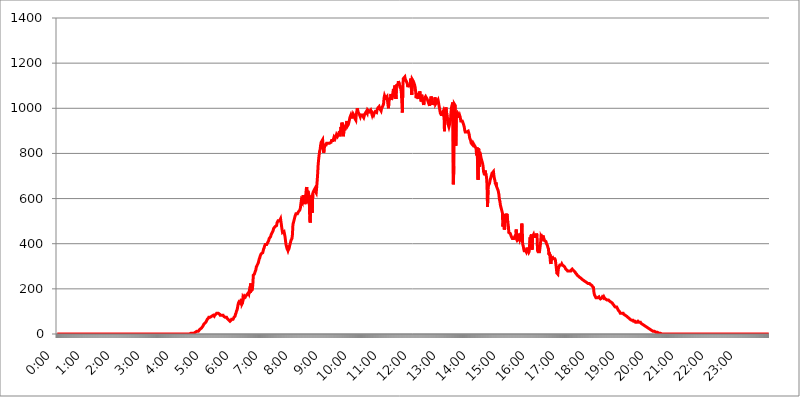
| Category | 2015.06.01. Intenzitás [W/m^2] |
|---|---|
| 0.0 | 0 |
| 0.0006944444444444445 | 0 |
| 0.001388888888888889 | 0 |
| 0.0020833333333333333 | 0 |
| 0.002777777777777778 | 0 |
| 0.003472222222222222 | 0 |
| 0.004166666666666667 | 0 |
| 0.004861111111111111 | 0 |
| 0.005555555555555556 | 0 |
| 0.0062499999999999995 | 0 |
| 0.006944444444444444 | 0 |
| 0.007638888888888889 | 0 |
| 0.008333333333333333 | 0 |
| 0.009027777777777779 | 0 |
| 0.009722222222222222 | 0 |
| 0.010416666666666666 | 0 |
| 0.011111111111111112 | 0 |
| 0.011805555555555555 | 0 |
| 0.012499999999999999 | 0 |
| 0.013194444444444444 | 0 |
| 0.013888888888888888 | 0 |
| 0.014583333333333332 | 0 |
| 0.015277777777777777 | 0 |
| 0.015972222222222224 | 0 |
| 0.016666666666666666 | 0 |
| 0.017361111111111112 | 0 |
| 0.018055555555555557 | 0 |
| 0.01875 | 0 |
| 0.019444444444444445 | 0 |
| 0.02013888888888889 | 0 |
| 0.020833333333333332 | 0 |
| 0.02152777777777778 | 0 |
| 0.022222222222222223 | 0 |
| 0.02291666666666667 | 0 |
| 0.02361111111111111 | 0 |
| 0.024305555555555556 | 0 |
| 0.024999999999999998 | 0 |
| 0.025694444444444447 | 0 |
| 0.02638888888888889 | 0 |
| 0.027083333333333334 | 0 |
| 0.027777777777777776 | 0 |
| 0.02847222222222222 | 0 |
| 0.029166666666666664 | 0 |
| 0.029861111111111113 | 0 |
| 0.030555555555555555 | 0 |
| 0.03125 | 0 |
| 0.03194444444444445 | 0 |
| 0.03263888888888889 | 0 |
| 0.03333333333333333 | 0 |
| 0.034027777777777775 | 0 |
| 0.034722222222222224 | 0 |
| 0.035416666666666666 | 0 |
| 0.036111111111111115 | 0 |
| 0.03680555555555556 | 0 |
| 0.0375 | 0 |
| 0.03819444444444444 | 0 |
| 0.03888888888888889 | 0 |
| 0.03958333333333333 | 0 |
| 0.04027777777777778 | 0 |
| 0.04097222222222222 | 0 |
| 0.041666666666666664 | 0 |
| 0.042361111111111106 | 0 |
| 0.04305555555555556 | 0 |
| 0.043750000000000004 | 0 |
| 0.044444444444444446 | 0 |
| 0.04513888888888889 | 0 |
| 0.04583333333333334 | 0 |
| 0.04652777777777778 | 0 |
| 0.04722222222222222 | 0 |
| 0.04791666666666666 | 0 |
| 0.04861111111111111 | 0 |
| 0.049305555555555554 | 0 |
| 0.049999999999999996 | 0 |
| 0.05069444444444445 | 0 |
| 0.051388888888888894 | 0 |
| 0.052083333333333336 | 0 |
| 0.05277777777777778 | 0 |
| 0.05347222222222222 | 0 |
| 0.05416666666666667 | 0 |
| 0.05486111111111111 | 0 |
| 0.05555555555555555 | 0 |
| 0.05625 | 0 |
| 0.05694444444444444 | 0 |
| 0.057638888888888885 | 0 |
| 0.05833333333333333 | 0 |
| 0.05902777777777778 | 0 |
| 0.059722222222222225 | 0 |
| 0.06041666666666667 | 0 |
| 0.061111111111111116 | 0 |
| 0.06180555555555556 | 0 |
| 0.0625 | 0 |
| 0.06319444444444444 | 0 |
| 0.06388888888888888 | 0 |
| 0.06458333333333334 | 0 |
| 0.06527777777777778 | 0 |
| 0.06597222222222222 | 0 |
| 0.06666666666666667 | 0 |
| 0.06736111111111111 | 0 |
| 0.06805555555555555 | 0 |
| 0.06874999999999999 | 0 |
| 0.06944444444444443 | 0 |
| 0.07013888888888889 | 0 |
| 0.07083333333333333 | 0 |
| 0.07152777777777779 | 0 |
| 0.07222222222222223 | 0 |
| 0.07291666666666667 | 0 |
| 0.07361111111111111 | 0 |
| 0.07430555555555556 | 0 |
| 0.075 | 0 |
| 0.07569444444444444 | 0 |
| 0.0763888888888889 | 0 |
| 0.07708333333333334 | 0 |
| 0.07777777777777778 | 0 |
| 0.07847222222222222 | 0 |
| 0.07916666666666666 | 0 |
| 0.0798611111111111 | 0 |
| 0.08055555555555556 | 0 |
| 0.08125 | 0 |
| 0.08194444444444444 | 0 |
| 0.08263888888888889 | 0 |
| 0.08333333333333333 | 0 |
| 0.08402777777777777 | 0 |
| 0.08472222222222221 | 0 |
| 0.08541666666666665 | 0 |
| 0.08611111111111112 | 0 |
| 0.08680555555555557 | 0 |
| 0.08750000000000001 | 0 |
| 0.08819444444444445 | 0 |
| 0.08888888888888889 | 0 |
| 0.08958333333333333 | 0 |
| 0.09027777777777778 | 0 |
| 0.09097222222222222 | 0 |
| 0.09166666666666667 | 0 |
| 0.09236111111111112 | 0 |
| 0.09305555555555556 | 0 |
| 0.09375 | 0 |
| 0.09444444444444444 | 0 |
| 0.09513888888888888 | 0 |
| 0.09583333333333333 | 0 |
| 0.09652777777777777 | 0 |
| 0.09722222222222222 | 0 |
| 0.09791666666666667 | 0 |
| 0.09861111111111111 | 0 |
| 0.09930555555555555 | 0 |
| 0.09999999999999999 | 0 |
| 0.10069444444444443 | 0 |
| 0.1013888888888889 | 0 |
| 0.10208333333333335 | 0 |
| 0.10277777777777779 | 0 |
| 0.10347222222222223 | 0 |
| 0.10416666666666667 | 0 |
| 0.10486111111111111 | 0 |
| 0.10555555555555556 | 0 |
| 0.10625 | 0 |
| 0.10694444444444444 | 0 |
| 0.1076388888888889 | 0 |
| 0.10833333333333334 | 0 |
| 0.10902777777777778 | 0 |
| 0.10972222222222222 | 0 |
| 0.1111111111111111 | 0 |
| 0.11180555555555556 | 0 |
| 0.11180555555555556 | 0 |
| 0.1125 | 0 |
| 0.11319444444444444 | 0 |
| 0.11388888888888889 | 0 |
| 0.11458333333333333 | 0 |
| 0.11527777777777777 | 0 |
| 0.11597222222222221 | 0 |
| 0.11666666666666665 | 0 |
| 0.1173611111111111 | 0 |
| 0.11805555555555557 | 0 |
| 0.11944444444444445 | 0 |
| 0.12013888888888889 | 0 |
| 0.12083333333333333 | 0 |
| 0.12152777777777778 | 0 |
| 0.12222222222222223 | 0 |
| 0.12291666666666667 | 0 |
| 0.12291666666666667 | 0 |
| 0.12361111111111112 | 0 |
| 0.12430555555555556 | 0 |
| 0.125 | 0 |
| 0.12569444444444444 | 0 |
| 0.12638888888888888 | 0 |
| 0.12708333333333333 | 0 |
| 0.16875 | 0 |
| 0.12847222222222224 | 0 |
| 0.12916666666666668 | 0 |
| 0.12986111111111112 | 0 |
| 0.13055555555555556 | 0 |
| 0.13125 | 0 |
| 0.13194444444444445 | 0 |
| 0.1326388888888889 | 0 |
| 0.13333333333333333 | 0 |
| 0.13402777777777777 | 0 |
| 0.13402777777777777 | 0 |
| 0.13472222222222222 | 0 |
| 0.13541666666666666 | 0 |
| 0.1361111111111111 | 0 |
| 0.13749999999999998 | 0 |
| 0.13819444444444443 | 0 |
| 0.1388888888888889 | 0 |
| 0.13958333333333334 | 0 |
| 0.14027777777777778 | 0 |
| 0.14097222222222222 | 0 |
| 0.14166666666666666 | 0 |
| 0.1423611111111111 | 0 |
| 0.14305555555555557 | 0 |
| 0.14375000000000002 | 0 |
| 0.14444444444444446 | 0 |
| 0.1451388888888889 | 0 |
| 0.1451388888888889 | 0 |
| 0.14652777777777778 | 0 |
| 0.14722222222222223 | 0 |
| 0.14791666666666667 | 0 |
| 0.1486111111111111 | 0 |
| 0.14930555555555555 | 0 |
| 0.15 | 0 |
| 0.15069444444444444 | 0 |
| 0.15138888888888888 | 0 |
| 0.15208333333333332 | 0 |
| 0.15277777777777776 | 0 |
| 0.15347222222222223 | 0 |
| 0.15416666666666667 | 0 |
| 0.15486111111111112 | 0 |
| 0.15555555555555556 | 0 |
| 0.15625 | 0 |
| 0.15694444444444444 | 0 |
| 0.15763888888888888 | 0 |
| 0.15833333333333333 | 0 |
| 0.15902777777777777 | 0 |
| 0.15972222222222224 | 0 |
| 0.16041666666666668 | 0 |
| 0.16111111111111112 | 0 |
| 0.16180555555555556 | 0 |
| 0.1625 | 0 |
| 0.16319444444444445 | 0 |
| 0.1638888888888889 | 0 |
| 0.16458333333333333 | 0 |
| 0.16527777777777777 | 0 |
| 0.16597222222222222 | 0 |
| 0.16666666666666666 | 0 |
| 0.1673611111111111 | 0 |
| 0.16805555555555554 | 0 |
| 0.16874999999999998 | 0 |
| 0.16944444444444443 | 0 |
| 0.17013888888888887 | 0 |
| 0.1708333333333333 | 0 |
| 0.17152777777777775 | 0 |
| 0.17222222222222225 | 0 |
| 0.1729166666666667 | 0 |
| 0.17361111111111113 | 0 |
| 0.17430555555555557 | 0 |
| 0.17500000000000002 | 0 |
| 0.17569444444444446 | 0 |
| 0.1763888888888889 | 0 |
| 0.17708333333333334 | 0 |
| 0.17777777777777778 | 0 |
| 0.17847222222222223 | 0 |
| 0.17916666666666667 | 0 |
| 0.1798611111111111 | 0 |
| 0.18055555555555555 | 0 |
| 0.18125 | 0 |
| 0.18194444444444444 | 0 |
| 0.1826388888888889 | 0 |
| 0.18333333333333335 | 0 |
| 0.1840277777777778 | 0 |
| 0.18472222222222223 | 0 |
| 0.18541666666666667 | 0 |
| 0.18611111111111112 | 3.525 |
| 0.18680555555555556 | 3.525 |
| 0.1875 | 3.525 |
| 0.18819444444444444 | 3.525 |
| 0.18888888888888888 | 3.525 |
| 0.18958333333333333 | 3.525 |
| 0.19027777777777777 | 3.525 |
| 0.1909722222222222 | 3.525 |
| 0.19166666666666665 | 3.525 |
| 0.19236111111111112 | 3.525 |
| 0.19305555555555554 | 7.887 |
| 0.19375 | 7.887 |
| 0.19444444444444445 | 7.887 |
| 0.1951388888888889 | 7.887 |
| 0.19583333333333333 | 12.257 |
| 0.19652777777777777 | 12.257 |
| 0.19722222222222222 | 12.257 |
| 0.19791666666666666 | 12.257 |
| 0.1986111111111111 | 16.636 |
| 0.19930555555555554 | 16.636 |
| 0.19999999999999998 | 21.024 |
| 0.20069444444444443 | 21.024 |
| 0.20138888888888887 | 25.419 |
| 0.2020833333333333 | 25.419 |
| 0.2027777777777778 | 29.823 |
| 0.2034722222222222 | 29.823 |
| 0.2041666666666667 | 34.234 |
| 0.20486111111111113 | 38.653 |
| 0.20555555555555557 | 43.079 |
| 0.20625000000000002 | 43.079 |
| 0.20694444444444446 | 47.511 |
| 0.2076388888888889 | 47.511 |
| 0.20833333333333334 | 51.951 |
| 0.20902777777777778 | 56.398 |
| 0.20972222222222223 | 60.85 |
| 0.21041666666666667 | 65.31 |
| 0.2111111111111111 | 65.31 |
| 0.21180555555555555 | 69.775 |
| 0.2125 | 74.246 |
| 0.21319444444444444 | 74.246 |
| 0.2138888888888889 | 74.246 |
| 0.21458333333333335 | 74.246 |
| 0.2152777777777778 | 74.246 |
| 0.21597222222222223 | 74.246 |
| 0.21666666666666667 | 78.722 |
| 0.21736111111111112 | 78.722 |
| 0.21805555555555556 | 78.722 |
| 0.21875 | 83.205 |
| 0.21944444444444444 | 83.205 |
| 0.22013888888888888 | 78.722 |
| 0.22083333333333333 | 83.205 |
| 0.22152777777777777 | 83.205 |
| 0.2222222222222222 | 87.692 |
| 0.22291666666666665 | 87.692 |
| 0.2236111111111111 | 92.184 |
| 0.22430555555555556 | 92.184 |
| 0.225 | 92.184 |
| 0.22569444444444445 | 92.184 |
| 0.2263888888888889 | 92.184 |
| 0.22708333333333333 | 92.184 |
| 0.22777777777777777 | 87.692 |
| 0.22847222222222222 | 83.205 |
| 0.22916666666666666 | 83.205 |
| 0.2298611111111111 | 83.205 |
| 0.23055555555555554 | 83.205 |
| 0.23124999999999998 | 83.205 |
| 0.23194444444444443 | 83.205 |
| 0.23263888888888887 | 83.205 |
| 0.2333333333333333 | 78.722 |
| 0.2340277777777778 | 78.722 |
| 0.2347222222222222 | 78.722 |
| 0.2354166666666667 | 74.246 |
| 0.23611111111111113 | 74.246 |
| 0.23680555555555557 | 74.246 |
| 0.23750000000000002 | 74.246 |
| 0.23819444444444446 | 69.775 |
| 0.2388888888888889 | 69.775 |
| 0.23958333333333334 | 65.31 |
| 0.24027777777777778 | 65.31 |
| 0.24097222222222223 | 60.85 |
| 0.24166666666666667 | 60.85 |
| 0.2423611111111111 | 56.398 |
| 0.24305555555555555 | 56.398 |
| 0.24375 | 60.85 |
| 0.24444444444444446 | 65.31 |
| 0.24513888888888888 | 65.31 |
| 0.24583333333333335 | 65.31 |
| 0.2465277777777778 | 65.31 |
| 0.24722222222222223 | 69.775 |
| 0.24791666666666667 | 74.246 |
| 0.24861111111111112 | 74.246 |
| 0.24930555555555556 | 78.722 |
| 0.25 | 87.692 |
| 0.25069444444444444 | 92.184 |
| 0.2513888888888889 | 101.184 |
| 0.2520833333333333 | 105.69 |
| 0.25277777777777777 | 114.716 |
| 0.2534722222222222 | 128.284 |
| 0.25416666666666665 | 137.347 |
| 0.2548611111111111 | 141.884 |
| 0.2555555555555556 | 141.884 |
| 0.25625000000000003 | 137.347 |
| 0.2569444444444445 | 137.347 |
| 0.2576388888888889 | 137.347 |
| 0.25833333333333336 | 155.509 |
| 0.2590277777777778 | 132.814 |
| 0.25972222222222224 | 137.347 |
| 0.2604166666666667 | 160.056 |
| 0.2611111111111111 | 155.509 |
| 0.26180555555555557 | 164.605 |
| 0.2625 | 169.156 |
| 0.26319444444444445 | 169.156 |
| 0.2638888888888889 | 164.605 |
| 0.26458333333333334 | 169.156 |
| 0.2652777777777778 | 169.156 |
| 0.2659722222222222 | 173.709 |
| 0.26666666666666666 | 173.709 |
| 0.2673611111111111 | 173.709 |
| 0.26805555555555555 | 182.82 |
| 0.26875 | 178.264 |
| 0.26944444444444443 | 191.937 |
| 0.2701388888888889 | 191.937 |
| 0.2708333333333333 | 182.82 |
| 0.27152777777777776 | 223.873 |
| 0.2722222222222222 | 191.937 |
| 0.27291666666666664 | 191.937 |
| 0.2736111111111111 | 196.497 |
| 0.2743055555555555 | 219.309 |
| 0.27499999999999997 | 260.373 |
| 0.27569444444444446 | 260.373 |
| 0.27638888888888885 | 264.932 |
| 0.27708333333333335 | 264.932 |
| 0.2777777777777778 | 278.603 |
| 0.27847222222222223 | 283.156 |
| 0.2791666666666667 | 296.808 |
| 0.2798611111111111 | 301.354 |
| 0.28055555555555556 | 305.898 |
| 0.28125 | 310.44 |
| 0.28194444444444444 | 314.98 |
| 0.2826388888888889 | 324.052 |
| 0.2833333333333333 | 333.113 |
| 0.28402777777777777 | 337.639 |
| 0.2847222222222222 | 346.682 |
| 0.28541666666666665 | 351.198 |
| 0.28611111111111115 | 355.712 |
| 0.28680555555555554 | 355.712 |
| 0.28750000000000003 | 355.712 |
| 0.2881944444444445 | 360.221 |
| 0.2888888888888889 | 369.23 |
| 0.28958333333333336 | 378.224 |
| 0.2902777777777778 | 382.715 |
| 0.29097222222222224 | 391.685 |
| 0.2916666666666667 | 396.164 |
| 0.2923611111111111 | 396.164 |
| 0.29305555555555557 | 396.164 |
| 0.29375 | 396.164 |
| 0.29444444444444445 | 400.638 |
| 0.2951388888888889 | 405.108 |
| 0.29583333333333334 | 409.574 |
| 0.2965277777777778 | 414.035 |
| 0.2972222222222222 | 422.943 |
| 0.29791666666666666 | 422.943 |
| 0.2986111111111111 | 422.943 |
| 0.29930555555555555 | 431.833 |
| 0.3 | 440.702 |
| 0.30069444444444443 | 440.702 |
| 0.3013888888888889 | 449.551 |
| 0.3020833333333333 | 449.551 |
| 0.30277777777777776 | 458.38 |
| 0.3034722222222222 | 467.187 |
| 0.30416666666666664 | 471.582 |
| 0.3048611111111111 | 471.582 |
| 0.3055555555555555 | 475.972 |
| 0.30624999999999997 | 471.582 |
| 0.3069444444444444 | 471.582 |
| 0.3076388888888889 | 480.356 |
| 0.30833333333333335 | 493.475 |
| 0.3090277777777778 | 497.836 |
| 0.30972222222222223 | 502.192 |
| 0.3104166666666667 | 502.192 |
| 0.3111111111111111 | 502.192 |
| 0.31180555555555556 | 502.192 |
| 0.3125 | 506.542 |
| 0.31319444444444444 | 510.885 |
| 0.3138888888888889 | 515.223 |
| 0.3145833333333333 | 510.885 |
| 0.31527777777777777 | 462.786 |
| 0.3159722222222222 | 449.551 |
| 0.31666666666666665 | 449.551 |
| 0.31736111111111115 | 453.968 |
| 0.31805555555555554 | 453.968 |
| 0.31875000000000003 | 449.551 |
| 0.3194444444444445 | 431.833 |
| 0.3201388888888889 | 414.035 |
| 0.32083333333333336 | 396.164 |
| 0.3215277777777778 | 387.202 |
| 0.32222222222222224 | 378.224 |
| 0.3229166666666667 | 373.729 |
| 0.3236111111111111 | 391.685 |
| 0.32430555555555557 | 373.729 |
| 0.325 | 378.224 |
| 0.32569444444444445 | 387.202 |
| 0.3263888888888889 | 396.164 |
| 0.32708333333333334 | 405.108 |
| 0.3277777777777778 | 414.035 |
| 0.3284722222222222 | 418.492 |
| 0.32916666666666666 | 422.943 |
| 0.3298611111111111 | 440.702 |
| 0.33055555555555555 | 484.735 |
| 0.33125 | 493.475 |
| 0.33194444444444443 | 502.192 |
| 0.3326388888888889 | 510.885 |
| 0.3333333333333333 | 519.555 |
| 0.3340277777777778 | 523.88 |
| 0.3347222222222222 | 532.513 |
| 0.3354166666666667 | 532.513 |
| 0.3361111111111111 | 532.513 |
| 0.3368055555555556 | 532.513 |
| 0.33749999999999997 | 536.82 |
| 0.33819444444444446 | 541.121 |
| 0.33888888888888885 | 541.121 |
| 0.33958333333333335 | 545.416 |
| 0.34027777777777773 | 549.704 |
| 0.34097222222222223 | 558.261 |
| 0.3416666666666666 | 575.299 |
| 0.3423611111111111 | 592.233 |
| 0.3430555555555555 | 592.233 |
| 0.34375 | 583.779 |
| 0.3444444444444445 | 609.062 |
| 0.3451388888888889 | 609.062 |
| 0.3458333333333334 | 613.252 |
| 0.34652777777777777 | 609.062 |
| 0.34722222222222227 | 575.299 |
| 0.34791666666666665 | 583.779 |
| 0.34861111111111115 | 617.436 |
| 0.34930555555555554 | 642.4 |
| 0.35000000000000003 | 650.667 |
| 0.3506944444444444 | 579.542 |
| 0.3513888888888889 | 634.105 |
| 0.3520833333333333 | 629.948 |
| 0.3527777777777778 | 617.436 |
| 0.3534722222222222 | 588.009 |
| 0.3541666666666667 | 506.542 |
| 0.3548611111111111 | 493.475 |
| 0.35555555555555557 | 613.252 |
| 0.35625 | 609.062 |
| 0.35694444444444445 | 596.45 |
| 0.3576388888888889 | 536.82 |
| 0.35833333333333334 | 621.613 |
| 0.3590277777777778 | 629.948 |
| 0.3597222222222222 | 629.948 |
| 0.36041666666666666 | 634.105 |
| 0.3611111111111111 | 642.4 |
| 0.36180555555555555 | 634.105 |
| 0.3625 | 629.948 |
| 0.36319444444444443 | 625.784 |
| 0.3638888888888889 | 650.667 |
| 0.3645833333333333 | 679.395 |
| 0.3652777777777778 | 711.832 |
| 0.3659722222222222 | 751.803 |
| 0.3666666666666667 | 775.492 |
| 0.3673611111111111 | 795.074 |
| 0.3680555555555556 | 810.641 |
| 0.36874999999999997 | 818.392 |
| 0.36944444444444446 | 837.682 |
| 0.37013888888888885 | 849.199 |
| 0.37083333333333335 | 849.199 |
| 0.37152777777777773 | 853.029 |
| 0.37222222222222223 | 860.676 |
| 0.3729166666666666 | 856.855 |
| 0.3736111111111111 | 802.868 |
| 0.3743055555555555 | 810.641 |
| 0.375 | 837.682 |
| 0.3756944444444445 | 837.682 |
| 0.3763888888888889 | 837.682 |
| 0.3770833333333334 | 837.682 |
| 0.37777777777777777 | 845.365 |
| 0.37847222222222227 | 845.365 |
| 0.37916666666666665 | 845.365 |
| 0.37986111111111115 | 845.365 |
| 0.38055555555555554 | 845.365 |
| 0.38125000000000003 | 849.199 |
| 0.3819444444444444 | 845.365 |
| 0.3826388888888889 | 845.365 |
| 0.3833333333333333 | 849.199 |
| 0.3840277777777778 | 849.199 |
| 0.3847222222222222 | 856.855 |
| 0.3854166666666667 | 860.676 |
| 0.3861111111111111 | 853.029 |
| 0.38680555555555557 | 856.855 |
| 0.3875 | 853.029 |
| 0.38819444444444445 | 872.114 |
| 0.3888888888888889 | 875.918 |
| 0.38958333333333334 | 864.493 |
| 0.3902777777777778 | 864.493 |
| 0.3909722222222222 | 875.918 |
| 0.39166666666666666 | 883.516 |
| 0.3923611111111111 | 879.719 |
| 0.39305555555555555 | 875.918 |
| 0.39375 | 875.918 |
| 0.39444444444444443 | 879.719 |
| 0.3951388888888889 | 891.099 |
| 0.3958333333333333 | 898.668 |
| 0.3965277777777778 | 875.918 |
| 0.3972222222222222 | 898.668 |
| 0.3979166666666667 | 917.534 |
| 0.3986111111111111 | 902.447 |
| 0.3993055555555556 | 936.33 |
| 0.39999999999999997 | 932.576 |
| 0.40069444444444446 | 921.298 |
| 0.40138888888888885 | 875.918 |
| 0.40208333333333335 | 909.996 |
| 0.40277777777777773 | 902.447 |
| 0.40347222222222223 | 917.534 |
| 0.4041666666666666 | 917.534 |
| 0.4048611111111111 | 925.06 |
| 0.4055555555555555 | 932.576 |
| 0.40625 | 943.832 |
| 0.4069444444444445 | 921.298 |
| 0.4076388888888889 | 921.298 |
| 0.4083333333333334 | 928.819 |
| 0.40902777777777777 | 932.576 |
| 0.40972222222222227 | 947.58 |
| 0.41041666666666665 | 958.814 |
| 0.41111111111111115 | 962.555 |
| 0.41180555555555554 | 970.034 |
| 0.41250000000000003 | 962.555 |
| 0.4131944444444444 | 955.071 |
| 0.4138888888888889 | 966.295 |
| 0.4145833333333333 | 958.814 |
| 0.4152777777777778 | 973.772 |
| 0.4159722222222222 | 977.508 |
| 0.4166666666666667 | 966.295 |
| 0.4173611111111111 | 955.071 |
| 0.41805555555555557 | 958.814 |
| 0.41875 | 947.58 |
| 0.41944444444444445 | 973.772 |
| 0.4201388888888889 | 984.98 |
| 0.42083333333333334 | 999.916 |
| 0.4215277777777778 | 988.714 |
| 0.4222222222222222 | 981.244 |
| 0.42291666666666666 | 977.508 |
| 0.4236111111111111 | 973.772 |
| 0.42430555555555555 | 973.772 |
| 0.425 | 962.555 |
| 0.42569444444444443 | 970.034 |
| 0.4263888888888889 | 973.772 |
| 0.4270833333333333 | 970.034 |
| 0.4277777777777778 | 970.034 |
| 0.4284722222222222 | 973.772 |
| 0.4291666666666667 | 970.034 |
| 0.4298611111111111 | 958.814 |
| 0.4305555555555556 | 958.814 |
| 0.43124999999999997 | 973.772 |
| 0.43194444444444446 | 973.772 |
| 0.43263888888888885 | 977.508 |
| 0.43333333333333335 | 984.98 |
| 0.43402777777777773 | 984.98 |
| 0.43472222222222223 | 977.508 |
| 0.4354166666666666 | 992.448 |
| 0.4361111111111111 | 988.714 |
| 0.4368055555555555 | 992.448 |
| 0.4375 | 984.98 |
| 0.4381944444444445 | 988.714 |
| 0.4388888888888889 | 984.98 |
| 0.4395833333333334 | 992.448 |
| 0.44027777777777777 | 992.448 |
| 0.44097222222222227 | 977.508 |
| 0.44166666666666665 | 970.034 |
| 0.44236111111111115 | 977.508 |
| 0.44305555555555554 | 973.772 |
| 0.44375000000000003 | 970.034 |
| 0.4444444444444444 | 977.508 |
| 0.4451388888888889 | 981.244 |
| 0.4458333333333333 | 984.98 |
| 0.4465277777777778 | 981.244 |
| 0.4472222222222222 | 988.714 |
| 0.4479166666666667 | 981.244 |
| 0.4486111111111111 | 992.448 |
| 0.44930555555555557 | 999.916 |
| 0.45 | 999.916 |
| 0.45069444444444445 | 999.916 |
| 0.4513888888888889 | 1007.383 |
| 0.45208333333333334 | 999.916 |
| 0.4527777777777778 | 996.182 |
| 0.4534722222222222 | 999.916 |
| 0.45416666666666666 | 988.714 |
| 0.4548611111111111 | 999.916 |
| 0.45555555555555555 | 1003.65 |
| 0.45625 | 1007.383 |
| 0.45694444444444443 | 1011.118 |
| 0.4576388888888889 | 1018.587 |
| 0.4583333333333333 | 1044.762 |
| 0.4590277777777778 | 1056.004 |
| 0.4597222222222222 | 1052.255 |
| 0.4604166666666667 | 1044.762 |
| 0.4611111111111111 | 1048.508 |
| 0.4618055555555556 | 1044.762 |
| 0.46249999999999997 | 1052.255 |
| 0.46319444444444446 | 1048.508 |
| 0.46388888888888885 | 1014.852 |
| 0.46458333333333335 | 999.916 |
| 0.46527777777777773 | 1041.019 |
| 0.46597222222222223 | 1044.762 |
| 0.4666666666666666 | 1041.019 |
| 0.4673611111111111 | 1044.762 |
| 0.4680555555555555 | 1063.51 |
| 0.46875 | 1037.277 |
| 0.4694444444444445 | 1033.537 |
| 0.4701388888888889 | 1052.255 |
| 0.4708333333333334 | 1071.027 |
| 0.47152777777777777 | 1086.097 |
| 0.47222222222222227 | 1078.555 |
| 0.47291666666666665 | 1086.097 |
| 0.47361111111111115 | 1101.226 |
| 0.47430555555555554 | 1105.019 |
| 0.47500000000000003 | 1041.019 |
| 0.4756944444444444 | 1101.226 |
| 0.4763888888888889 | 1101.226 |
| 0.4770833333333333 | 1097.437 |
| 0.4777777777777778 | 1105.019 |
| 0.4784722222222222 | 1120.238 |
| 0.4791666666666667 | 1116.426 |
| 0.4798611111111111 | 1105.019 |
| 0.48055555555555557 | 1093.653 |
| 0.48125 | 1089.873 |
| 0.48194444444444445 | 1086.097 |
| 0.4826388888888889 | 1067.267 |
| 0.48333333333333334 | 1063.51 |
| 0.4840277777777778 | 981.244 |
| 0.4847222222222222 | 1101.226 |
| 0.48541666666666666 | 1131.708 |
| 0.4861111111111111 | 1135.543 |
| 0.48680555555555555 | 1131.708 |
| 0.4875 | 1139.384 |
| 0.48819444444444443 | 1127.879 |
| 0.4888888888888889 | 1124.056 |
| 0.4895833333333333 | 1120.238 |
| 0.4902777777777778 | 1120.238 |
| 0.4909722222222222 | 1108.816 |
| 0.4916666666666667 | 1093.653 |
| 0.4923611111111111 | 1101.226 |
| 0.4930555555555556 | 1105.019 |
| 0.49374999999999997 | 1097.437 |
| 0.49444444444444446 | 1101.226 |
| 0.49513888888888885 | 1112.618 |
| 0.49583333333333335 | 1131.708 |
| 0.49652777777777773 | 1131.708 |
| 0.49722222222222223 | 1059.756 |
| 0.4979166666666666 | 1127.879 |
| 0.4986111111111111 | 1124.056 |
| 0.4993055555555555 | 1120.238 |
| 0.5 | 1116.426 |
| 0.5006944444444444 | 1108.816 |
| 0.5013888888888889 | 1101.226 |
| 0.5020833333333333 | 1089.873 |
| 0.5027777777777778 | 1071.027 |
| 0.5034722222222222 | 1044.762 |
| 0.5041666666666667 | 1067.267 |
| 0.5048611111111111 | 1059.756 |
| 0.5055555555555555 | 1056.004 |
| 0.50625 | 1041.019 |
| 0.5069444444444444 | 1056.004 |
| 0.5076388888888889 | 1059.756 |
| 0.5083333333333333 | 1074.789 |
| 0.5090277777777777 | 1067.267 |
| 0.5097222222222222 | 1063.51 |
| 0.5104166666666666 | 1029.798 |
| 0.5111111111111112 | 1059.756 |
| 0.5118055555555555 | 1063.51 |
| 0.5125000000000001 | 1037.277 |
| 0.5131944444444444 | 1033.537 |
| 0.513888888888889 | 1014.852 |
| 0.5145833333333333 | 1026.06 |
| 0.5152777777777778 | 1044.762 |
| 0.5159722222222222 | 1044.762 |
| 0.5166666666666667 | 1052.255 |
| 0.517361111111111 | 1056.004 |
| 0.5180555555555556 | 1052.255 |
| 0.5187499999999999 | 1041.019 |
| 0.5194444444444445 | 1041.019 |
| 0.5201388888888888 | 1029.798 |
| 0.5208333333333334 | 1022.323 |
| 0.5215277777777778 | 1022.323 |
| 0.5222222222222223 | 1011.118 |
| 0.5229166666666667 | 1029.798 |
| 0.5236111111111111 | 1033.537 |
| 0.5243055555555556 | 1052.255 |
| 0.525 | 1056.004 |
| 0.5256944444444445 | 1037.277 |
| 0.5263888888888889 | 1014.852 |
| 0.5270833333333333 | 1022.323 |
| 0.5277777777777778 | 1029.798 |
| 0.5284722222222222 | 1018.587 |
| 0.5291666666666667 | 1029.798 |
| 0.5298611111111111 | 1048.508 |
| 0.5305555555555556 | 1018.587 |
| 0.53125 | 1014.852 |
| 0.5319444444444444 | 1018.587 |
| 0.5326388888888889 | 1029.798 |
| 0.5333333333333333 | 1033.537 |
| 0.5340277777777778 | 1037.277 |
| 0.5347222222222222 | 1026.06 |
| 0.5354166666666667 | 1011.118 |
| 0.5361111111111111 | 999.916 |
| 0.5368055555555555 | 988.714 |
| 0.5375 | 973.772 |
| 0.5381944444444444 | 984.98 |
| 0.5388888888888889 | 966.295 |
| 0.5395833333333333 | 962.555 |
| 0.5402777777777777 | 977.508 |
| 0.5409722222222222 | 981.244 |
| 0.5416666666666666 | 988.714 |
| 0.5423611111111112 | 977.508 |
| 0.5430555555555555 | 898.668 |
| 0.5437500000000001 | 977.508 |
| 0.5444444444444444 | 992.448 |
| 0.545138888888889 | 1003.65 |
| 0.5458333333333333 | 1007.383 |
| 0.5465277777777778 | 1007.383 |
| 0.5472222222222222 | 951.327 |
| 0.5479166666666667 | 932.576 |
| 0.548611111111111 | 925.06 |
| 0.5493055555555556 | 917.534 |
| 0.5499999999999999 | 917.534 |
| 0.5506944444444445 | 921.298 |
| 0.5513888888888888 | 943.832 |
| 0.5520833333333334 | 973.772 |
| 0.5527777777777778 | 999.916 |
| 0.5534722222222223 | 1011.118 |
| 0.5541666666666667 | 1007.383 |
| 0.5548611111111111 | 1026.06 |
| 0.5555555555555556 | 663.019 |
| 0.55625 | 743.859 |
| 0.5569444444444445 | 1018.587 |
| 0.5576388888888889 | 1018.587 |
| 0.5583333333333333 | 1011.118 |
| 0.5590277777777778 | 833.834 |
| 0.5597222222222222 | 984.98 |
| 0.5604166666666667 | 958.814 |
| 0.5611111111111111 | 970.034 |
| 0.5618055555555556 | 977.508 |
| 0.5625 | 977.508 |
| 0.5631944444444444 | 970.034 |
| 0.5638888888888889 | 958.814 |
| 0.5645833333333333 | 966.295 |
| 0.5652777777777778 | 958.814 |
| 0.5659722222222222 | 943.832 |
| 0.5666666666666667 | 947.58 |
| 0.5673611111111111 | 940.082 |
| 0.5680555555555555 | 943.832 |
| 0.56875 | 940.082 |
| 0.5694444444444444 | 932.576 |
| 0.5701388888888889 | 932.576 |
| 0.5708333333333333 | 917.534 |
| 0.5715277777777777 | 902.447 |
| 0.5722222222222222 | 894.885 |
| 0.5729166666666666 | 898.668 |
| 0.5736111111111112 | 894.885 |
| 0.5743055555555555 | 894.885 |
| 0.5750000000000001 | 898.668 |
| 0.5756944444444444 | 894.885 |
| 0.576388888888889 | 898.668 |
| 0.5770833333333333 | 891.099 |
| 0.5777777777777778 | 883.516 |
| 0.5784722222222222 | 868.305 |
| 0.5791666666666667 | 864.493 |
| 0.579861111111111 | 856.855 |
| 0.5805555555555556 | 845.365 |
| 0.5812499999999999 | 841.526 |
| 0.5819444444444445 | 845.365 |
| 0.5826388888888888 | 837.682 |
| 0.5833333333333334 | 845.365 |
| 0.5840277777777778 | 841.526 |
| 0.5847222222222223 | 837.682 |
| 0.5854166666666667 | 833.834 |
| 0.5861111111111111 | 833.834 |
| 0.5868055555555556 | 826.123 |
| 0.5875 | 818.392 |
| 0.5881944444444445 | 791.169 |
| 0.5888888888888889 | 826.123 |
| 0.5895833333333333 | 826.123 |
| 0.5902777777777778 | 683.473 |
| 0.5909722222222222 | 822.26 |
| 0.5916666666666667 | 739.877 |
| 0.5923611111111111 | 806.757 |
| 0.5930555555555556 | 802.868 |
| 0.59375 | 791.169 |
| 0.5944444444444444 | 779.42 |
| 0.5951388888888889 | 771.559 |
| 0.5958333333333333 | 767.62 |
| 0.5965277777777778 | 755.766 |
| 0.5972222222222222 | 743.859 |
| 0.5979166666666667 | 719.877 |
| 0.5986111111111111 | 723.889 |
| 0.5993055555555555 | 703.762 |
| 0.6 | 723.889 |
| 0.6006944444444444 | 723.889 |
| 0.6013888888888889 | 703.762 |
| 0.6020833333333333 | 695.666 |
| 0.6027777777777777 | 658.909 |
| 0.6034722222222222 | 562.53 |
| 0.6041666666666666 | 638.256 |
| 0.6048611111111112 | 658.909 |
| 0.6055555555555555 | 658.909 |
| 0.6062500000000001 | 667.123 |
| 0.6069444444444444 | 679.395 |
| 0.607638888888889 | 683.473 |
| 0.6083333333333333 | 695.666 |
| 0.6090277777777778 | 703.762 |
| 0.6097222222222222 | 711.832 |
| 0.6104166666666667 | 715.858 |
| 0.611111111111111 | 715.858 |
| 0.6118055555555556 | 719.877 |
| 0.6124999999999999 | 699.717 |
| 0.6131944444444445 | 687.544 |
| 0.6138888888888888 | 679.395 |
| 0.6145833333333334 | 663.019 |
| 0.6152777777777778 | 671.22 |
| 0.6159722222222223 | 654.791 |
| 0.6166666666666667 | 658.909 |
| 0.6173611111111111 | 654.791 |
| 0.6180555555555556 | 638.256 |
| 0.61875 | 629.948 |
| 0.6194444444444445 | 617.436 |
| 0.6201388888888889 | 596.45 |
| 0.6208333333333333 | 588.009 |
| 0.6215277777777778 | 571.049 |
| 0.6222222222222222 | 566.793 |
| 0.6229166666666667 | 553.986 |
| 0.6236111111111111 | 549.704 |
| 0.6243055555555556 | 536.82 |
| 0.625 | 475.972 |
| 0.6256944444444444 | 471.582 |
| 0.6263888888888889 | 506.542 |
| 0.6270833333333333 | 462.786 |
| 0.6277777777777778 | 471.582 |
| 0.6284722222222222 | 532.513 |
| 0.6291666666666667 | 515.223 |
| 0.6298611111111111 | 497.836 |
| 0.6305555555555555 | 532.513 |
| 0.63125 | 532.513 |
| 0.6319444444444444 | 493.475 |
| 0.6326388888888889 | 480.356 |
| 0.6333333333333333 | 449.551 |
| 0.6340277777777777 | 445.129 |
| 0.6347222222222222 | 445.129 |
| 0.6354166666666666 | 445.129 |
| 0.6361111111111112 | 440.702 |
| 0.6368055555555555 | 431.833 |
| 0.6375000000000001 | 427.39 |
| 0.6381944444444444 | 422.943 |
| 0.638888888888889 | 422.943 |
| 0.6395833333333333 | 422.943 |
| 0.6402777777777778 | 422.943 |
| 0.6409722222222222 | 427.39 |
| 0.6416666666666667 | 431.833 |
| 0.642361111111111 | 431.833 |
| 0.6430555555555556 | 427.39 |
| 0.6437499999999999 | 462.786 |
| 0.6444444444444445 | 418.492 |
| 0.6451388888888888 | 414.035 |
| 0.6458333333333334 | 414.035 |
| 0.6465277777777778 | 418.492 |
| 0.6472222222222223 | 418.492 |
| 0.6479166666666667 | 427.39 |
| 0.6486111111111111 | 445.129 |
| 0.6493055555555556 | 418.492 |
| 0.65 | 418.492 |
| 0.6506944444444445 | 427.39 |
| 0.6513888888888889 | 489.108 |
| 0.6520833333333333 | 475.972 |
| 0.6527777777777778 | 396.164 |
| 0.6534722222222222 | 391.685 |
| 0.6541666666666667 | 378.224 |
| 0.6548611111111111 | 369.23 |
| 0.6555555555555556 | 369.23 |
| 0.65625 | 369.23 |
| 0.6569444444444444 | 369.23 |
| 0.6576388888888889 | 364.728 |
| 0.6583333333333333 | 364.728 |
| 0.6590277777777778 | 382.715 |
| 0.6597222222222222 | 369.23 |
| 0.6604166666666667 | 364.728 |
| 0.6611111111111111 | 360.221 |
| 0.6618055555555555 | 364.728 |
| 0.6625 | 364.728 |
| 0.6631944444444444 | 427.39 |
| 0.6638888888888889 | 378.224 |
| 0.6645833333333333 | 436.27 |
| 0.6652777777777777 | 440.702 |
| 0.6659722222222222 | 373.729 |
| 0.6666666666666666 | 431.833 |
| 0.6673611111111111 | 436.27 |
| 0.6680555555555556 | 440.702 |
| 0.6687500000000001 | 431.833 |
| 0.6694444444444444 | 431.833 |
| 0.6701388888888888 | 431.833 |
| 0.6708333333333334 | 431.833 |
| 0.6715277777777778 | 436.27 |
| 0.6722222222222222 | 445.129 |
| 0.6729166666666666 | 436.27 |
| 0.6736111111111112 | 369.23 |
| 0.6743055555555556 | 364.728 |
| 0.6749999999999999 | 364.728 |
| 0.6756944444444444 | 364.728 |
| 0.6763888888888889 | 364.728 |
| 0.6770833333333334 | 364.728 |
| 0.6777777777777777 | 400.638 |
| 0.6784722222222223 | 431.833 |
| 0.6791666666666667 | 427.39 |
| 0.6798611111111111 | 431.833 |
| 0.6805555555555555 | 427.39 |
| 0.68125 | 436.27 |
| 0.6819444444444445 | 427.39 |
| 0.6826388888888889 | 422.943 |
| 0.6833333333333332 | 414.035 |
| 0.6840277777777778 | 414.035 |
| 0.6847222222222222 | 414.035 |
| 0.6854166666666667 | 409.574 |
| 0.686111111111111 | 400.638 |
| 0.6868055555555556 | 396.164 |
| 0.6875 | 391.685 |
| 0.6881944444444444 | 382.715 |
| 0.688888888888889 | 378.224 |
| 0.6895833333333333 | 351.198 |
| 0.6902777777777778 | 360.221 |
| 0.6909722222222222 | 346.682 |
| 0.6916666666666668 | 319.517 |
| 0.6923611111111111 | 310.44 |
| 0.6930555555555555 | 337.639 |
| 0.69375 | 333.113 |
| 0.6944444444444445 | 333.113 |
| 0.6951388888888889 | 337.639 |
| 0.6958333333333333 | 333.113 |
| 0.6965277777777777 | 333.113 |
| 0.6972222222222223 | 333.113 |
| 0.6979166666666666 | 333.113 |
| 0.6986111111111111 | 328.584 |
| 0.6993055555555556 | 328.584 |
| 0.7000000000000001 | 292.259 |
| 0.7006944444444444 | 269.49 |
| 0.7013888888888888 | 269.49 |
| 0.7020833333333334 | 264.932 |
| 0.7027777777777778 | 287.709 |
| 0.7034722222222222 | 296.808 |
| 0.7041666666666666 | 301.354 |
| 0.7048611111111112 | 305.898 |
| 0.7055555555555556 | 305.898 |
| 0.7062499999999999 | 305.898 |
| 0.7069444444444444 | 305.898 |
| 0.7076388888888889 | 310.44 |
| 0.7083333333333334 | 305.898 |
| 0.7090277777777777 | 305.898 |
| 0.7097222222222223 | 305.898 |
| 0.7104166666666667 | 301.354 |
| 0.7111111111111111 | 301.354 |
| 0.7118055555555555 | 296.808 |
| 0.7125 | 292.259 |
| 0.7131944444444445 | 287.709 |
| 0.7138888888888889 | 287.709 |
| 0.7145833333333332 | 283.156 |
| 0.7152777777777778 | 283.156 |
| 0.7159722222222222 | 278.603 |
| 0.7166666666666667 | 278.603 |
| 0.717361111111111 | 278.603 |
| 0.7180555555555556 | 278.603 |
| 0.71875 | 278.603 |
| 0.7194444444444444 | 278.603 |
| 0.720138888888889 | 278.603 |
| 0.7208333333333333 | 283.156 |
| 0.7215277777777778 | 283.156 |
| 0.7222222222222222 | 287.709 |
| 0.7229166666666668 | 287.709 |
| 0.7236111111111111 | 283.156 |
| 0.7243055555555555 | 283.156 |
| 0.725 | 278.603 |
| 0.7256944444444445 | 278.603 |
| 0.7263888888888889 | 274.047 |
| 0.7270833333333333 | 269.49 |
| 0.7277777777777777 | 269.49 |
| 0.7284722222222223 | 264.932 |
| 0.7291666666666666 | 260.373 |
| 0.7298611111111111 | 260.373 |
| 0.7305555555555556 | 260.373 |
| 0.7312500000000001 | 255.813 |
| 0.7319444444444444 | 255.813 |
| 0.7326388888888888 | 251.251 |
| 0.7333333333333334 | 251.251 |
| 0.7340277777777778 | 251.251 |
| 0.7347222222222222 | 246.689 |
| 0.7354166666666666 | 246.689 |
| 0.7361111111111112 | 242.127 |
| 0.7368055555555556 | 242.127 |
| 0.7374999999999999 | 242.127 |
| 0.7381944444444444 | 237.564 |
| 0.7388888888888889 | 237.564 |
| 0.7395833333333334 | 237.564 |
| 0.7402777777777777 | 233 |
| 0.7409722222222223 | 233 |
| 0.7416666666666667 | 233 |
| 0.7423611111111111 | 228.436 |
| 0.7430555555555555 | 228.436 |
| 0.74375 | 228.436 |
| 0.7444444444444445 | 223.873 |
| 0.7451388888888889 | 223.873 |
| 0.7458333333333332 | 223.873 |
| 0.7465277777777778 | 223.873 |
| 0.7472222222222222 | 223.873 |
| 0.7479166666666667 | 219.309 |
| 0.748611111111111 | 219.309 |
| 0.7493055555555556 | 219.309 |
| 0.75 | 214.746 |
| 0.7506944444444444 | 210.182 |
| 0.751388888888889 | 210.182 |
| 0.7520833333333333 | 205.62 |
| 0.7527777777777778 | 182.82 |
| 0.7534722222222222 | 173.709 |
| 0.7541666666666668 | 169.156 |
| 0.7548611111111111 | 164.605 |
| 0.7555555555555555 | 160.056 |
| 0.75625 | 160.056 |
| 0.7569444444444445 | 160.056 |
| 0.7576388888888889 | 160.056 |
| 0.7583333333333333 | 160.056 |
| 0.7590277777777777 | 160.056 |
| 0.7597222222222223 | 164.605 |
| 0.7604166666666666 | 160.056 |
| 0.7611111111111111 | 160.056 |
| 0.7618055555555556 | 155.509 |
| 0.7625000000000001 | 155.509 |
| 0.7631944444444444 | 155.509 |
| 0.7638888888888888 | 160.056 |
| 0.7645833333333334 | 164.605 |
| 0.7652777777777778 | 164.605 |
| 0.7659722222222222 | 160.056 |
| 0.7666666666666666 | 164.605 |
| 0.7673611111111112 | 160.056 |
| 0.7680555555555556 | 160.056 |
| 0.7687499999999999 | 155.509 |
| 0.7694444444444444 | 155.509 |
| 0.7701388888888889 | 155.509 |
| 0.7708333333333334 | 150.964 |
| 0.7715277777777777 | 150.964 |
| 0.7722222222222223 | 150.964 |
| 0.7729166666666667 | 150.964 |
| 0.7736111111111111 | 150.964 |
| 0.7743055555555555 | 146.423 |
| 0.775 | 146.423 |
| 0.7756944444444445 | 146.423 |
| 0.7763888888888889 | 141.884 |
| 0.7770833333333332 | 141.884 |
| 0.7777777777777778 | 141.884 |
| 0.7784722222222222 | 137.347 |
| 0.7791666666666667 | 132.814 |
| 0.779861111111111 | 132.814 |
| 0.7805555555555556 | 128.284 |
| 0.78125 | 123.758 |
| 0.7819444444444444 | 123.758 |
| 0.782638888888889 | 119.235 |
| 0.7833333333333333 | 119.235 |
| 0.7840277777777778 | 119.235 |
| 0.7847222222222222 | 119.235 |
| 0.7854166666666668 | 114.716 |
| 0.7861111111111111 | 110.201 |
| 0.7868055555555555 | 105.69 |
| 0.7875 | 105.69 |
| 0.7881944444444445 | 101.184 |
| 0.7888888888888889 | 96.682 |
| 0.7895833333333333 | 92.184 |
| 0.7902777777777777 | 92.184 |
| 0.7909722222222223 | 92.184 |
| 0.7916666666666666 | 92.184 |
| 0.7923611111111111 | 92.184 |
| 0.7930555555555556 | 92.184 |
| 0.7937500000000001 | 92.184 |
| 0.7944444444444444 | 87.692 |
| 0.7951388888888888 | 87.692 |
| 0.7958333333333334 | 87.692 |
| 0.7965277777777778 | 83.205 |
| 0.7972222222222222 | 83.205 |
| 0.7979166666666666 | 83.205 |
| 0.7986111111111112 | 78.722 |
| 0.7993055555555556 | 78.722 |
| 0.7999999999999999 | 74.246 |
| 0.8006944444444444 | 74.246 |
| 0.8013888888888889 | 74.246 |
| 0.8020833333333334 | 69.775 |
| 0.8027777777777777 | 69.775 |
| 0.8034722222222223 | 65.31 |
| 0.8041666666666667 | 65.31 |
| 0.8048611111111111 | 65.31 |
| 0.8055555555555555 | 60.85 |
| 0.80625 | 60.85 |
| 0.8069444444444445 | 60.85 |
| 0.8076388888888889 | 60.85 |
| 0.8083333333333332 | 56.398 |
| 0.8090277777777778 | 56.398 |
| 0.8097222222222222 | 56.398 |
| 0.8104166666666667 | 56.398 |
| 0.811111111111111 | 51.951 |
| 0.8118055555555556 | 51.951 |
| 0.8125 | 51.951 |
| 0.8131944444444444 | 51.951 |
| 0.813888888888889 | 51.951 |
| 0.8145833333333333 | 56.398 |
| 0.8152777777777778 | 56.398 |
| 0.8159722222222222 | 51.951 |
| 0.8166666666666668 | 51.951 |
| 0.8173611111111111 | 51.951 |
| 0.8180555555555555 | 51.951 |
| 0.81875 | 47.511 |
| 0.8194444444444445 | 47.511 |
| 0.8201388888888889 | 47.511 |
| 0.8208333333333333 | 43.079 |
| 0.8215277777777777 | 43.079 |
| 0.8222222222222223 | 38.653 |
| 0.8229166666666666 | 38.653 |
| 0.8236111111111111 | 38.653 |
| 0.8243055555555556 | 34.234 |
| 0.8250000000000001 | 34.234 |
| 0.8256944444444444 | 29.823 |
| 0.8263888888888888 | 29.823 |
| 0.8270833333333334 | 29.823 |
| 0.8277777777777778 | 29.823 |
| 0.8284722222222222 | 25.419 |
| 0.8291666666666666 | 25.419 |
| 0.8298611111111112 | 21.024 |
| 0.8305555555555556 | 21.024 |
| 0.8312499999999999 | 21.024 |
| 0.8319444444444444 | 16.636 |
| 0.8326388888888889 | 16.636 |
| 0.8333333333333334 | 16.636 |
| 0.8340277777777777 | 12.257 |
| 0.8347222222222223 | 12.257 |
| 0.8354166666666667 | 12.257 |
| 0.8361111111111111 | 12.257 |
| 0.8368055555555555 | 12.257 |
| 0.8375 | 12.257 |
| 0.8381944444444445 | 7.887 |
| 0.8388888888888889 | 7.887 |
| 0.8395833333333332 | 7.887 |
| 0.8402777777777778 | 7.887 |
| 0.8409722222222222 | 7.887 |
| 0.8416666666666667 | 7.887 |
| 0.842361111111111 | 3.525 |
| 0.8430555555555556 | 3.525 |
| 0.84375 | 3.525 |
| 0.8444444444444444 | 3.525 |
| 0.845138888888889 | 3.525 |
| 0.8458333333333333 | 3.525 |
| 0.8465277777777778 | 3.525 |
| 0.8472222222222222 | 0 |
| 0.8479166666666668 | 0 |
| 0.8486111111111111 | 0 |
| 0.8493055555555555 | 0 |
| 0.85 | 0 |
| 0.8506944444444445 | 0 |
| 0.8513888888888889 | 0 |
| 0.8520833333333333 | 0 |
| 0.8527777777777777 | 0 |
| 0.8534722222222223 | 0 |
| 0.8541666666666666 | 0 |
| 0.8548611111111111 | 0 |
| 0.8555555555555556 | 0 |
| 0.8562500000000001 | 0 |
| 0.8569444444444444 | 0 |
| 0.8576388888888888 | 0 |
| 0.8583333333333334 | 0 |
| 0.8590277777777778 | 0 |
| 0.8597222222222222 | 0 |
| 0.8604166666666666 | 0 |
| 0.8611111111111112 | 0 |
| 0.8618055555555556 | 0 |
| 0.8624999999999999 | 0 |
| 0.8631944444444444 | 0 |
| 0.8638888888888889 | 0 |
| 0.8645833333333334 | 0 |
| 0.8652777777777777 | 0 |
| 0.8659722222222223 | 0 |
| 0.8666666666666667 | 0 |
| 0.8673611111111111 | 0 |
| 0.8680555555555555 | 0 |
| 0.86875 | 0 |
| 0.8694444444444445 | 0 |
| 0.8701388888888889 | 0 |
| 0.8708333333333332 | 0 |
| 0.8715277777777778 | 0 |
| 0.8722222222222222 | 0 |
| 0.8729166666666667 | 0 |
| 0.873611111111111 | 0 |
| 0.8743055555555556 | 0 |
| 0.875 | 0 |
| 0.8756944444444444 | 0 |
| 0.876388888888889 | 0 |
| 0.8770833333333333 | 0 |
| 0.8777777777777778 | 0 |
| 0.8784722222222222 | 0 |
| 0.8791666666666668 | 0 |
| 0.8798611111111111 | 0 |
| 0.8805555555555555 | 0 |
| 0.88125 | 0 |
| 0.8819444444444445 | 0 |
| 0.8826388888888889 | 0 |
| 0.8833333333333333 | 0 |
| 0.8840277777777777 | 0 |
| 0.8847222222222223 | 0 |
| 0.8854166666666666 | 0 |
| 0.8861111111111111 | 0 |
| 0.8868055555555556 | 0 |
| 0.8875000000000001 | 0 |
| 0.8881944444444444 | 0 |
| 0.8888888888888888 | 0 |
| 0.8895833333333334 | 0 |
| 0.8902777777777778 | 0 |
| 0.8909722222222222 | 0 |
| 0.8916666666666666 | 0 |
| 0.8923611111111112 | 0 |
| 0.8930555555555556 | 0 |
| 0.8937499999999999 | 0 |
| 0.8944444444444444 | 0 |
| 0.8951388888888889 | 0 |
| 0.8958333333333334 | 0 |
| 0.8965277777777777 | 0 |
| 0.8972222222222223 | 0 |
| 0.8979166666666667 | 0 |
| 0.8986111111111111 | 0 |
| 0.8993055555555555 | 0 |
| 0.9 | 0 |
| 0.9006944444444445 | 0 |
| 0.9013888888888889 | 0 |
| 0.9020833333333332 | 0 |
| 0.9027777777777778 | 0 |
| 0.9034722222222222 | 0 |
| 0.9041666666666667 | 0 |
| 0.904861111111111 | 0 |
| 0.9055555555555556 | 0 |
| 0.90625 | 0 |
| 0.9069444444444444 | 0 |
| 0.907638888888889 | 0 |
| 0.9083333333333333 | 0 |
| 0.9090277777777778 | 0 |
| 0.9097222222222222 | 0 |
| 0.9104166666666668 | 0 |
| 0.9111111111111111 | 0 |
| 0.9118055555555555 | 0 |
| 0.9125 | 0 |
| 0.9131944444444445 | 0 |
| 0.9138888888888889 | 0 |
| 0.9145833333333333 | 0 |
| 0.9152777777777777 | 0 |
| 0.9159722222222223 | 0 |
| 0.9166666666666666 | 0 |
| 0.9173611111111111 | 0 |
| 0.9180555555555556 | 0 |
| 0.9187500000000001 | 0 |
| 0.9194444444444444 | 0 |
| 0.9201388888888888 | 0 |
| 0.9208333333333334 | 0 |
| 0.9215277777777778 | 0 |
| 0.9222222222222222 | 0 |
| 0.9229166666666666 | 0 |
| 0.9236111111111112 | 0 |
| 0.9243055555555556 | 0 |
| 0.9249999999999999 | 0 |
| 0.9256944444444444 | 0 |
| 0.9263888888888889 | 0 |
| 0.9270833333333334 | 0 |
| 0.9277777777777777 | 0 |
| 0.9284722222222223 | 0 |
| 0.9291666666666667 | 0 |
| 0.9298611111111111 | 0 |
| 0.9305555555555555 | 0 |
| 0.93125 | 0 |
| 0.9319444444444445 | 0 |
| 0.9326388888888889 | 0 |
| 0.9333333333333332 | 0 |
| 0.9340277777777778 | 0 |
| 0.9347222222222222 | 0 |
| 0.9354166666666667 | 0 |
| 0.936111111111111 | 0 |
| 0.9368055555555556 | 0 |
| 0.9375 | 0 |
| 0.9381944444444444 | 0 |
| 0.938888888888889 | 0 |
| 0.9395833333333333 | 0 |
| 0.9402777777777778 | 0 |
| 0.9409722222222222 | 0 |
| 0.9416666666666668 | 0 |
| 0.9423611111111111 | 0 |
| 0.9430555555555555 | 0 |
| 0.94375 | 0 |
| 0.9444444444444445 | 0 |
| 0.9451388888888889 | 0 |
| 0.9458333333333333 | 0 |
| 0.9465277777777777 | 0 |
| 0.9472222222222223 | 0 |
| 0.9479166666666666 | 0 |
| 0.9486111111111111 | 0 |
| 0.9493055555555556 | 0 |
| 0.9500000000000001 | 0 |
| 0.9506944444444444 | 0 |
| 0.9513888888888888 | 0 |
| 0.9520833333333334 | 0 |
| 0.9527777777777778 | 0 |
| 0.9534722222222222 | 0 |
| 0.9541666666666666 | 0 |
| 0.9548611111111112 | 0 |
| 0.9555555555555556 | 0 |
| 0.9562499999999999 | 0 |
| 0.9569444444444444 | 0 |
| 0.9576388888888889 | 0 |
| 0.9583333333333334 | 0 |
| 0.9590277777777777 | 0 |
| 0.9597222222222223 | 0 |
| 0.9604166666666667 | 0 |
| 0.9611111111111111 | 0 |
| 0.9618055555555555 | 0 |
| 0.9625 | 0 |
| 0.9631944444444445 | 0 |
| 0.9638888888888889 | 0 |
| 0.9645833333333332 | 0 |
| 0.9652777777777778 | 0 |
| 0.9659722222222222 | 0 |
| 0.9666666666666667 | 0 |
| 0.967361111111111 | 0 |
| 0.9680555555555556 | 0 |
| 0.96875 | 0 |
| 0.9694444444444444 | 0 |
| 0.970138888888889 | 0 |
| 0.9708333333333333 | 0 |
| 0.9715277777777778 | 0 |
| 0.9722222222222222 | 0 |
| 0.9729166666666668 | 0 |
| 0.9736111111111111 | 0 |
| 0.9743055555555555 | 0 |
| 0.975 | 0 |
| 0.9756944444444445 | 0 |
| 0.9763888888888889 | 0 |
| 0.9770833333333333 | 0 |
| 0.9777777777777777 | 0 |
| 0.9784722222222223 | 0 |
| 0.9791666666666666 | 0 |
| 0.9798611111111111 | 0 |
| 0.9805555555555556 | 0 |
| 0.9812500000000001 | 0 |
| 0.9819444444444444 | 0 |
| 0.9826388888888888 | 0 |
| 0.9833333333333334 | 0 |
| 0.9840277777777778 | 0 |
| 0.9847222222222222 | 0 |
| 0.9854166666666666 | 0 |
| 0.9861111111111112 | 0 |
| 0.9868055555555556 | 0 |
| 0.9874999999999999 | 0 |
| 0.9881944444444444 | 0 |
| 0.9888888888888889 | 0 |
| 0.9895833333333334 | 0 |
| 0.9902777777777777 | 0 |
| 0.9909722222222223 | 0 |
| 0.9916666666666667 | 0 |
| 0.9923611111111111 | 0 |
| 0.9930555555555555 | 0 |
| 0.99375 | 0 |
| 0.9944444444444445 | 0 |
| 0.9951388888888889 | 0 |
| 0.9958333333333332 | 0 |
| 0.9965277777777778 | 0 |
| 0.9972222222222222 | 0 |
| 0.9979166666666667 | 0 |
| 0.998611111111111 | 0 |
| 0.9993055555555556 | 0 |